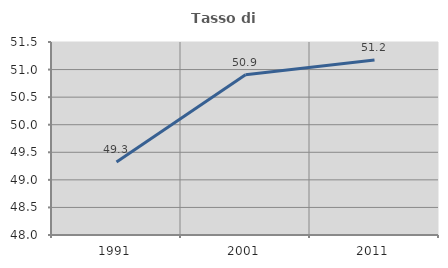
| Category | Tasso di occupazione   |
|---|---|
| 1991.0 | 49.324 |
| 2001.0 | 50.907 |
| 2011.0 | 51.172 |